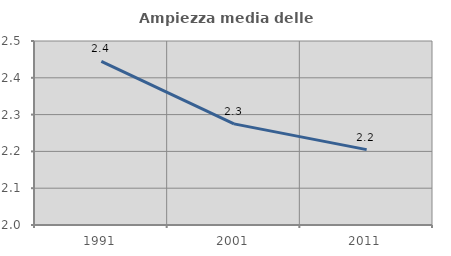
| Category | Ampiezza media delle famiglie |
|---|---|
| 1991.0 | 2.444 |
| 2001.0 | 2.275 |
| 2011.0 | 2.205 |